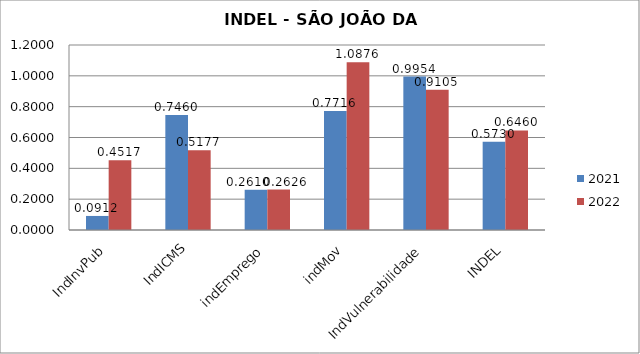
| Category | 2021 | 2022 |
|---|---|---|
| IndInvPub | 0.091 | 0.452 |
| IndICMS | 0.746 | 0.518 |
| indEmprego | 0.261 | 0.263 |
| indMov | 0.772 | 1.088 |
| IndVulnerabilidade | 0.995 | 0.911 |
| INDEL | 0.573 | 0.646 |